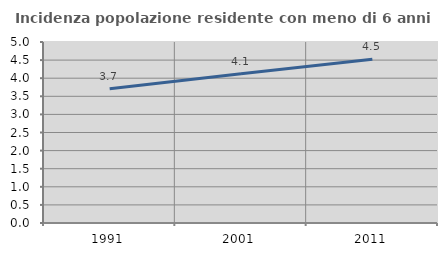
| Category | Incidenza popolazione residente con meno di 6 anni |
|---|---|
| 1991.0 | 3.709 |
| 2001.0 | 4.124 |
| 2011.0 | 4.526 |